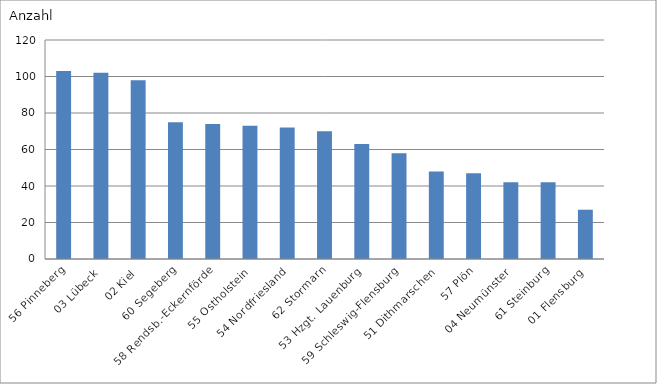
| Category | 56 Pinneberg |
|---|---|
| 56 Pinneberg | 103 |
| 03 Lübeck | 102 |
| 02 Kiel | 98 |
| 60 Segeberg | 75 |
| 58 Rendsb.-Eckernförde | 74 |
| 55 Ostholstein | 73 |
| 54 Nordfriesland | 72 |
| 62 Stormarn | 70 |
| 53 Hzgt. Lauenburg | 63 |
| 59 Schleswig-Flensburg | 58 |
| 51 Dithmarschen | 48 |
| 57 Plön | 47 |
| 04 Neumünster | 42 |
| 61 Steinburg | 42 |
| 01 Flensburg | 27 |